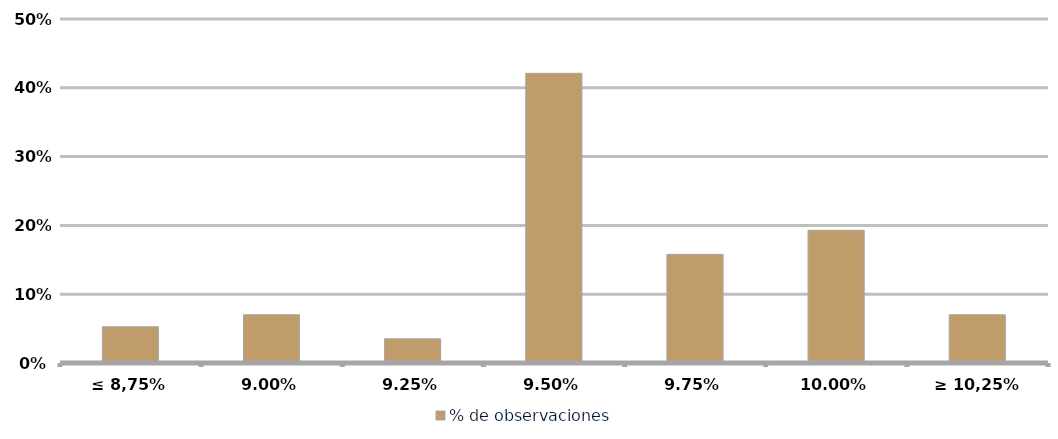
| Category | % de observaciones  |
|---|---|
| ≤ 8,75% | 0.053 |
| 9,00% | 0.07 |
| 9,25% | 0.035 |
| 9,50% | 0.421 |
| 9,75% | 0.158 |
| 10,00% | 0.193 |
| ≥ 10,25% | 0.07 |